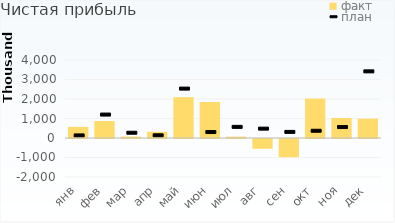
| Category | факт |
|---|---|
| янв | 570598.4 |
| фев | 873336.926 |
| мар | 74366.68 |
| апр | 316877.639 |
| май | 2092542.272 |
| июн | 1845429.286 |
| июл | 68608.621 |
| авг | -502483.65 |
| сен | -932452.143 |
| окт | 2023133.203 |
| ноя | 1026193.246 |
| дек | 993750.034 |